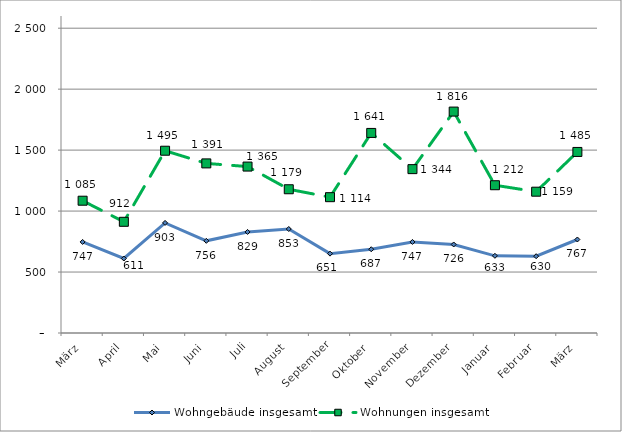
| Category | Wohngebäude insgesamt | Wohnungen insgesamt |
|---|---|---|
| März | 747 | 1085 |
| April | 611 | 912 |
| Mai | 903 | 1495 |
| Juni | 756 | 1391 |
| Juli | 829 | 1365 |
| August | 853 | 1179 |
| September | 651 | 1114 |
| Oktober | 687 | 1641 |
| November | 747 | 1344 |
| Dezember | 726 | 1816 |
| Januar | 633 | 1212 |
| Februar | 630 | 1159 |
| März | 767 | 1485 |